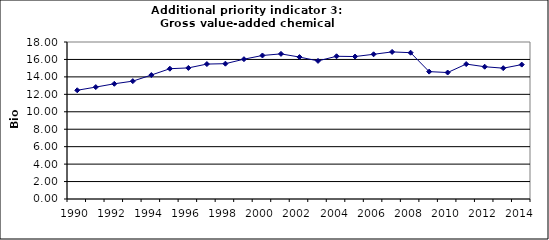
| Category | Gross value-added chemical industry, Bio Euro (EC95) |
|---|---|
| 1990 | 12.466 |
| 1991 | 12.83 |
| 1992 | 13.21 |
| 1993 | 13.513 |
| 1994 | 14.21 |
| 1995 | 14.938 |
| 1996 | 15.029 |
| 1997 | 15.469 |
| 1998 | 15.515 |
| 1999 | 16.03 |
| 2000 | 16.455 |
| 2001 | 16.637 |
| 2002 | 16.273 |
| 2003 | 15.833 |
| 2004 | 16.364 |
| 2005 | 16.334 |
| 2006 | 16.592 |
| 2007 | 16.864 |
| 2008 | 16.773 |
| 2009 | 14.605 |
| 2010 | 14.499 |
| 2011 | 15.469 |
| 2012 | 15.166 |
| 2013 | 14.999 |
| 2014 | 15.409 |